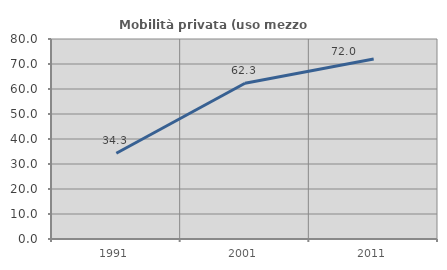
| Category | Mobilità privata (uso mezzo privato) |
|---|---|
| 1991.0 | 34.287 |
| 2001.0 | 62.308 |
| 2011.0 | 72.018 |